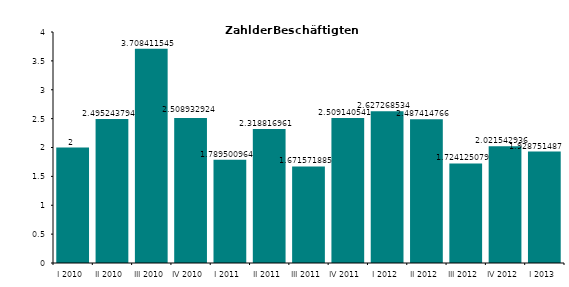
| Category | Series 0 |
|---|---|
| I 2010 | 2 |
| II 2010 | 2.495 |
| III 2010 | 3.708 |
| IV 2010 | 2.509 |
| I 2011 | 1.79 |
| II 2011 | 2.319 |
| III 2011 | 1.672 |
| IV 2011 | 2.509 |
| I 2012 | 2.627 |
| II 2012 | 2.487 |
| III 2012 | 1.724 |
| IV 2012 | 2.022 |
| I 2013 | 1.929 |